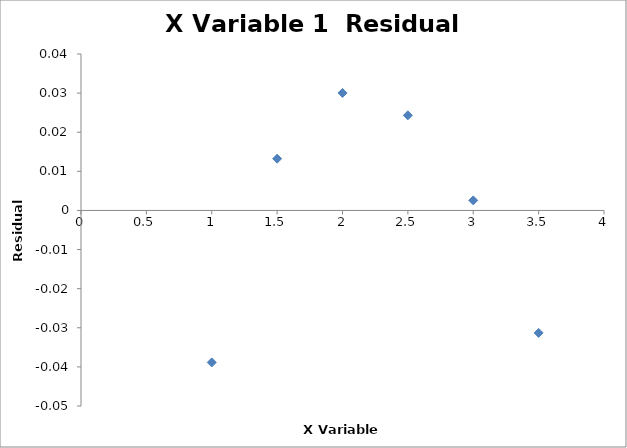
| Category | Series 0 |
|---|---|
| 1.0 | -0.039 |
| 1.5 | 0.013 |
| 2.0 | 0.03 |
| 2.5 | 0.024 |
| 3.0 | 0.003 |
| 3.5 | -0.031 |